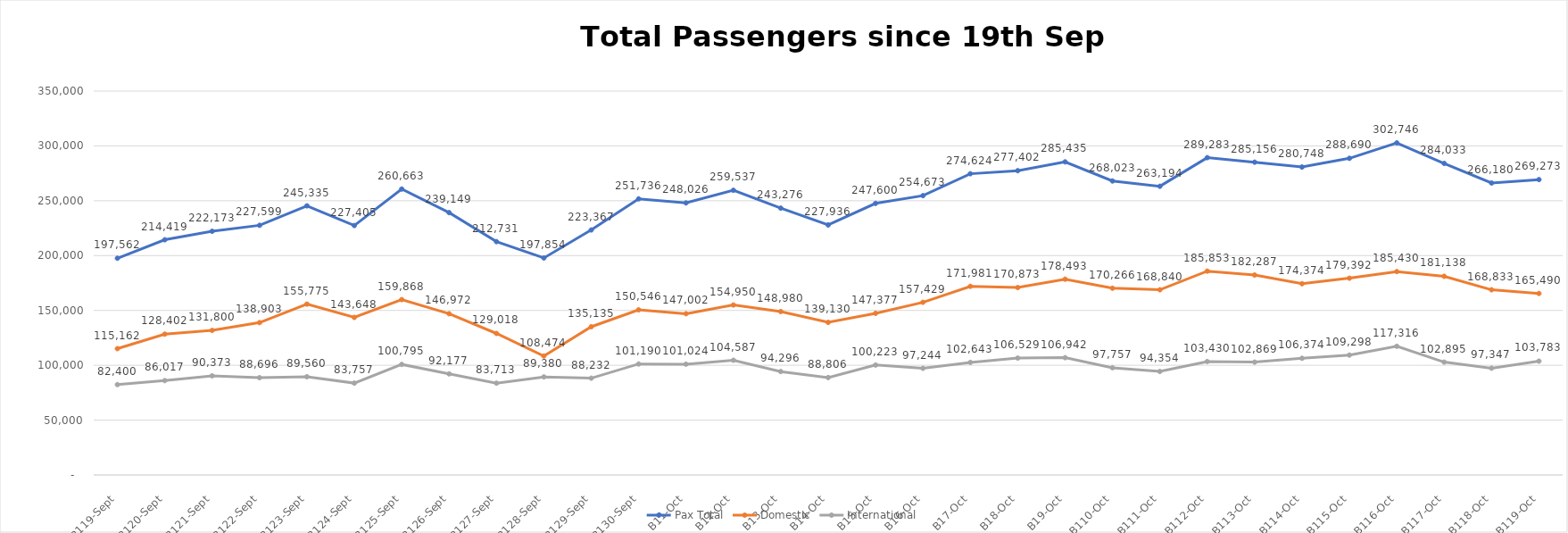
| Category | Pax Total |  Domestic  |  International  |
|---|---|---|---|
| 2022-09-19 | 197562 | 115162 | 82400 |
| 2022-09-20 | 214419 | 128402 | 86017 |
| 2022-09-21 | 222173 | 131800 | 90373 |
| 2022-09-22 | 227599 | 138903 | 88696 |
| 2022-09-23 | 245335 | 155775 | 89560 |
| 2022-09-24 | 227405 | 143648 | 83757 |
| 2022-09-25 | 260663 | 159868 | 100795 |
| 2022-09-26 | 239149 | 146972 | 92177 |
| 2022-09-27 | 212731 | 129018 | 83713 |
| 2022-09-28 | 197854 | 108474 | 89380 |
| 2022-09-29 | 223367 | 135135 | 88232 |
| 2022-09-30 | 251736 | 150546 | 101190 |
| 2022-10-01 | 248026 | 147002 | 101024 |
| 2022-10-02 | 259537 | 154950 | 104587 |
| 2022-10-03 | 243276 | 148980 | 94296 |
| 2022-10-04 | 227936 | 139130 | 88806 |
| 2022-10-05 | 247600 | 147377 | 100223 |
| 2022-10-06 | 254673 | 157429 | 97244 |
| 2022-10-07 | 274624 | 171981 | 102643 |
| 2022-10-08 | 277402 | 170873 | 106529 |
| 2022-10-09 | 285435 | 178493 | 106942 |
| 2022-10-10 | 268023 | 170266 | 97757 |
| 2022-10-11 | 263194 | 168840 | 94354 |
| 2022-10-12 | 289283 | 185853 | 103430 |
| 2022-10-13 | 285156 | 182287 | 102869 |
| 2022-10-14 | 280748 | 174374 | 106374 |
| 2022-10-15 | 288690 | 179392 | 109298 |
| 2022-10-16 | 302746 | 185430 | 117316 |
| 2022-10-17 | 284033 | 181138 | 102895 |
| 2022-10-18 | 266180 | 168833 | 97347 |
| 2022-10-19 | 269273 | 165490 | 103783 |